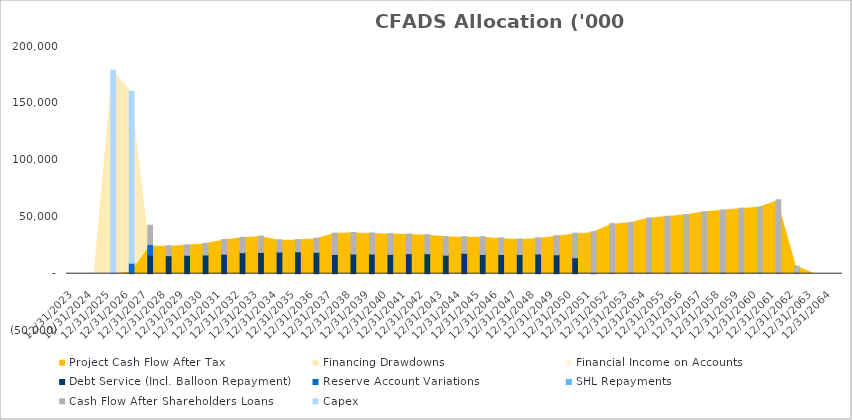
| Category | Debt Service (Incl. Balloon Repayment) | Reserve Account Variations | SHL Repayments | Cash Flow After Shareholders Loans | Capex |
|---|---|---|---|---|---|
| 12/31/23 | 0 | 0 | 0 | 0 | 0 |
| 12/31/24 | 0 | 0 | 0 | 0 | 0 |
| 12/31/25 | 0 | 0 | 0 | 0 | 179179.084 |
| 12/31/26 | 0 | 9238.314 | 0 | 0 | 151368.979 |
| 12/31/27 | 16373.688 | 9238.314 | 0 | 17073.509 | 0 |
| 12/31/28 | 15885.811 | 0 | 0 | 8693.375 | 0 |
| 12/31/29 | 16204.342 | 0 | 0 | 9201.831 | 0 |
| 12/31/30 | 16468.833 | 0 | 0 | 10281.232 | 0 |
| 12/31/31 | 17168.836 | 0 | 0 | 12884.893 | 0 |
| 12/31/32 | 18519.985 | 0 | 0 | 13483.473 | 0 |
| 12/31/33 | 18709.354 | 0 | 0 | 14415.166 | 0 |
| 12/31/34 | 19043.242 | 0 | 0 | 10865.741 | 0 |
| 12/31/35 | 19297.923 | 0 | 0 | 10716.684 | 0 |
| 12/31/36 | 18782.823 | 0 | 0 | 12475.344 | 0 |
| 12/31/37 | 16947.945 | 0 | 0 | 18781.847 | 0 |
| 12/31/38 | 17280.277 | 0 | 0 | 19076.063 | 0 |
| 12/31/39 | 17282.037 | 0 | 0 | 18552.181 | 0 |
| 12/31/40 | 16950.943 | 0 | 0 | 18277.63 | 0 |
| 12/31/41 | 17631.869 | 0 | 0 | 17251.512 | 0 |
| 12/31/42 | 17567.285 | 0 | 0 | 16743.884 | 0 |
| 12/31/43 | 16288.797 | 0 | 0 | 16482.75 | 0 |
| 12/31/44 | 17970.342 | 0 | 0 | 14568.79 | 0 |
| 12/31/45 | 16916.656 | 0 | 0 | 15648.859 | 0 |
| 12/31/46 | 16916.881 | 0 | 0 | 14566.317 | 0 |
| 12/31/47 | 16852.788 | 0 | 0 | 13680.174 | 0 |
| 12/31/48 | 17326.487 | 0 | 0 | 14251.022 | 0 |
| 12/31/49 | 16605.362 | 0 | 0 | 16835.141 | 0 |
| 12/31/50 | 14051.385 | 0 | 0 | 21576.077 | 0 |
| 12/31/51 | 27.402 | 0 | 0 | 36934.706 | 0 |
| 12/31/52 | 0 | 0 | 0 | 44073.733 | 0 |
| 12/31/53 | 0 | 0 | 0 | 45084.946 | 0 |
| 12/31/54 | 0 | 0 | 0 | 48955.554 | 0 |
| 12/31/55 | 0 | 0 | 0 | 50507.944 | 0 |
| 12/31/56 | 0 | 0 | 0 | 52107.848 | 0 |
| 12/31/57 | 0 | 0 | 0 | 54575.483 | 0 |
| 12/31/58 | 0 | 0 | 0 | 56015.1 | 0 |
| 12/31/59 | 0 | 0 | 0 | 57667.583 | 0 |
| 12/31/60 | 0 | 0 | 0 | 58702.717 | 0 |
| 12/31/61 | 0 | 0 | 0 | 65070.247 | 0 |
| 12/31/62 | 0 | 0 | 0 | 6737.106 | 0 |
| 12/31/63 | 0 | 0 | 0 | 0 | 0 |
| 12/31/64 | 0 | 0 | 0 | 0 | 0 |
| 12/31/65 | 0 | 0 | 0 | 0 | 0 |
| 12/31/66 | 0 | 0 | 0 | 0 | 0 |
| 12/31/67 | 0 | 0 | 0 | 0 | 0 |
| 12/31/68 | 0 | 0 | 0 | 0 | 0 |
| 12/31/69 | 0 | 0 | 0 | 0 | 0 |
| 12/31/70 | 0 | 0 | 0 | 0 | 0 |
| 12/31/71 | 0 | 0 | 0 | 0 | 0 |
| 12/31/72 | 0 | 0 | 0 | 0 | 0 |
| 12/31/73 | 0 | 0 | 0 | 0 | 0 |
| 12/31/74 | 0 | 0 | 0 | 0 | 0 |
| 12/31/75 | 0 | 0 | 0 | 0 | 0 |
| 12/31/76 | 0 | 0 | 0 | 0 | 0 |
| 12/31/77 | 0 | 0 | 0 | 0 | 0 |
| 12/31/78 | 0 | 0 | 0 | 0 | 0 |
| 12/31/79 | 0 | 0 | 0 | 0 | 0 |
| 12/31/80 | 0 | 0 | 0 | 0 | 0 |
| 12/31/81 | 0 | 0 | 0 | 0 | 0 |
| 12/31/82 | 0 | 0 | 0 | 0 | 0 |